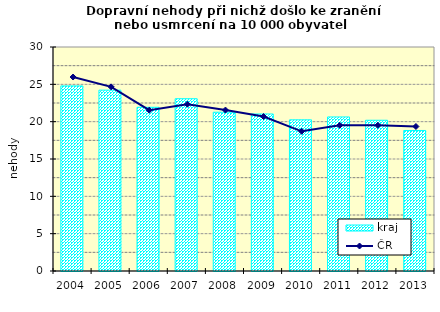
| Category | kraj |
|---|---|
| 2004.0 | 24.79 |
| 2005.0 | 24.222 |
| 2006.0 | 21.926 |
| 2007.0 | 23.069 |
| 2008.0 | 21.264 |
| 2009.0 | 21.028 |
| 2010.0 | 20.242 |
| 2011.0 | 20.63 |
| 2012.0 | 20.188 |
| 2013.0 | 18.821 |